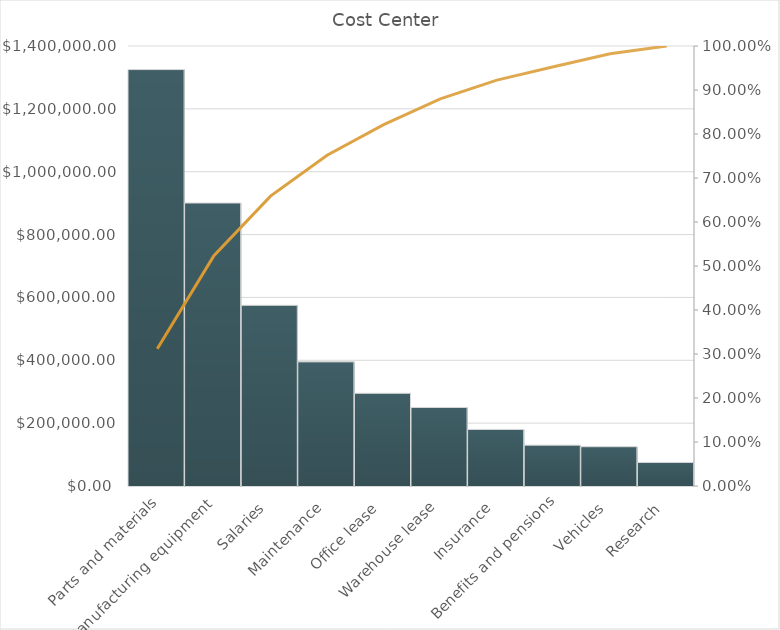
| Category | Annual Cost  |
|---|---|
| Parts and materials | 1325000 |
| Manufacturing equipment | 900500 |
| Salaries | 575000 |
| Maintenance | 395000 |
| Office lease | 295000 |
| Warehouse lease | 250000 |
| Insurance | 180000 |
| Benefits and pensions | 130000 |
| Vehicles | 125000 |
| Research | 75000 |